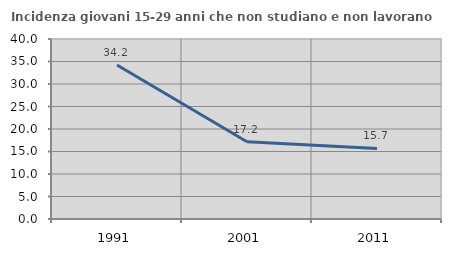
| Category | Incidenza giovani 15-29 anni che non studiano e non lavorano  |
|---|---|
| 1991.0 | 34.211 |
| 2001.0 | 17.157 |
| 2011.0 | 15.67 |